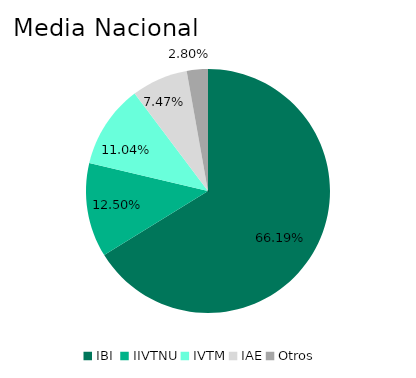
| Category | Media Nacional |
|---|---|
| IBI  | 0.662 |
| IIVTNU | 0.125 |
| IVTM | 0.11 |
| IAE | 0.075 |
| Otros | 0.028 |